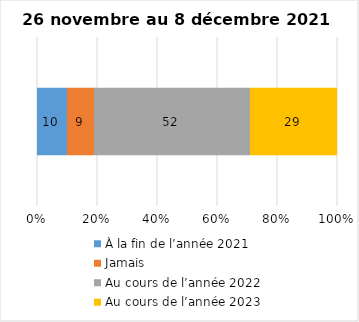
| Category | À la fin de l’année 2021 | Jamais | Au cours de l’année 2022 | Au cours de l’année 2023 |
|---|---|---|---|---|
| 0 | 10 | 9 | 52 | 29 |